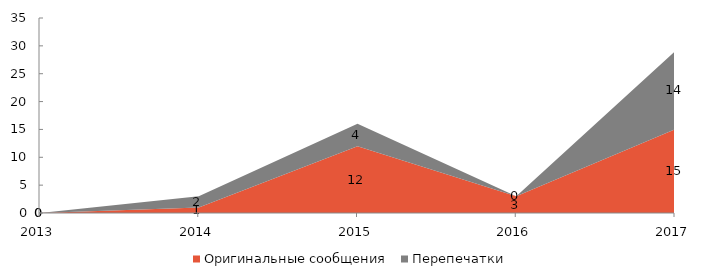
| Category | Оригинальные сообщения | Перепечатки |
|---|---|---|
| 2013 | 0 | 0 |
| 2014 | 1 | 2 |
| 2015 | 12 | 4 |
| 2016 | 3 | 0 |
| 2017 | 15 | 14 |